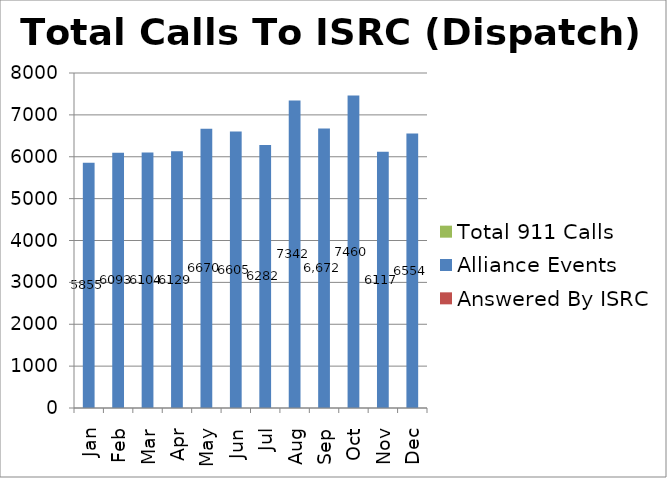
| Category | Answered By ISRC | Alliance Events | Total 911 Calls |
|---|---|---|---|
| Jan |  | 5855 |  |
| Feb |  | 6093 |  |
| Mar |  | 6104 |  |
| Apr |  | 6129 |  |
| May |  | 6670 |  |
| Jun |  | 6605 |  |
| Jul |  | 6282 |  |
| Aug |  | 7342 |  |
| Sep |  | 6672 |  |
| Oct |  | 7460 |  |
| Nov |  | 6117 |  |
| Dec |  | 6554 |  |